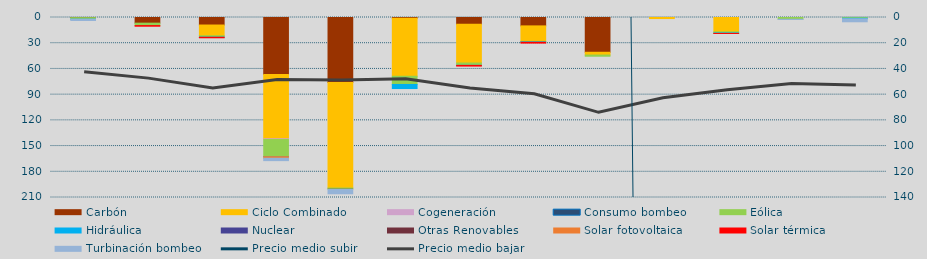
| Category | Carbón | Ciclo Combinado | Cogeneración | Consumo bombeo | Eólica | Hidráulica | Nuclear | Otras Renovables | Solar fotovoltaica | Solar térmica | Turbinación bombeo |
|---|---|---|---|---|---|---|---|---|---|---|---|
| 0 | 158.4 | 0 | 0 |  | 1844.3 | 12 |  | 0 | 0 | 0 | 1460 |
| 1 | 6575 | 0 | 0 |  | 2859 | 0 |  | 0 | 0 | 725.3 | 0 |
| 2 | 8771 | 12552 | 0 |  | 1652.9 | 70 |  | 0 | 0 | 608.7 | 0 |
| 3 | 66423 | 75034.9 | 910.1 |  | 19943.3 | 36 |  | 0 | 1820.4 | 0 | 2822.9 |
| 4 | 75870.4 | 123130.8 | 0 |  | 1278.3 | 0 |  | 288.4 | 0 | 0 | 5090.1 |
| 5 | 802.5 | 67762.6 | 0 |  | 9561.7 | 4762.5 |  | 0 | 0 | 0 | 0 |
| 6 | 7913 | 45184 | 0 |  | 2732.2 | 54.3 |  | 0 | 0 | 784 | 0 |
| 7 | 9798 | 18106.5 | 0 |  | 568.3 | 428.4 |  | 0 | 0 | 944 | 0 |
| 8 | 40570 | 3247 | 0 |  | 1377.6 | 0 |  | 0 | 0 | 0 | 0 |
| 9 | 0 | 1230 | 0 |  | 0 | 0 |  | 0 | 0 | 0 | 0 |
| 10 | 0 | 16736 | 0 |  | 1262.8 | 563.7 |  | 0 | 25.9 | 0.7 | 0 |
| 11 | 0 | 0 | 0 |  | 2064.3 | 0 |  | 0 | 0 | 0 | 200 |
| 12 | 0 | 0 | 0 |  | 855.2 | 637 |  | 0 | 0 | 0 | 3504.5 |